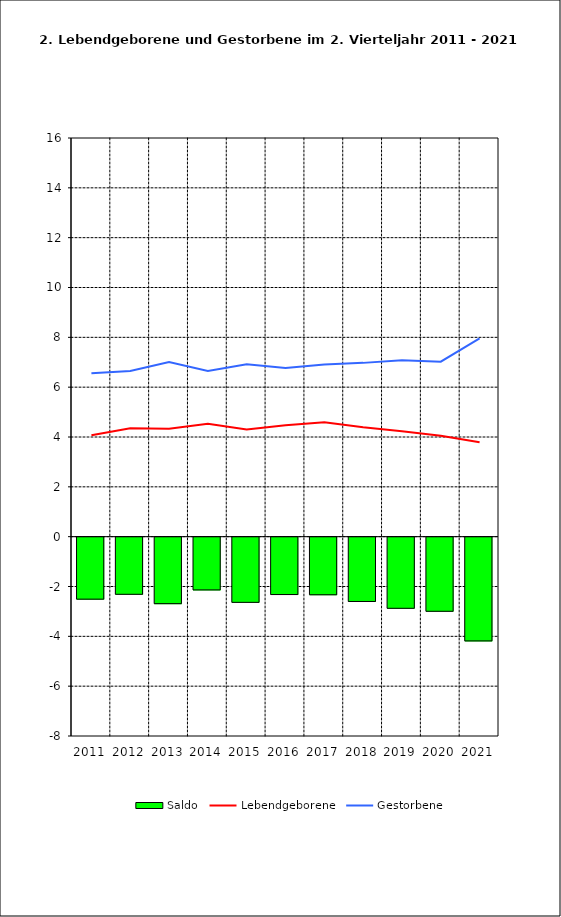
| Category | Saldo |
|---|---|
| 2011.0 | -2.488 |
| 2012.0 | -2.293 |
| 2013.0 | -2.669 |
| 2014.0 | -2.117 |
| 2015.0 | -2.616 |
| 2016.0 | -2.303 |
| 2017.0 | -2.312 |
| 2018.0 | -2.581 |
| 2019.0 | -2.855 |
| 2020.0 | -2.975 |
| 2021.0 | -4.164 |